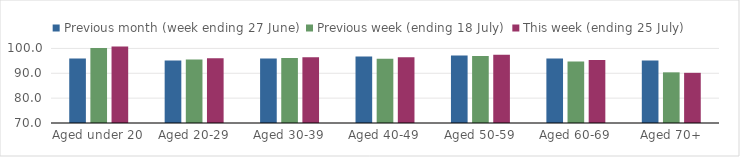
| Category | Previous month (week ending 27 June) | Previous week (ending 18 July) | This week (ending 25 July) |
|---|---|---|---|
| Aged under 20 | 95.969 | 100.195 | 100.765 |
| Aged 20-29 | 95.121 | 95.563 | 96.03 |
| Aged 30-39 | 95.968 | 96.126 | 96.432 |
| Aged 40-49 | 96.773 | 95.814 | 96.495 |
| Aged 50-59 | 97.108 | 96.973 | 97.503 |
| Aged 60-69 | 95.945 | 94.743 | 95.306 |
| Aged 70+ | 95.191 | 90.381 | 90.189 |